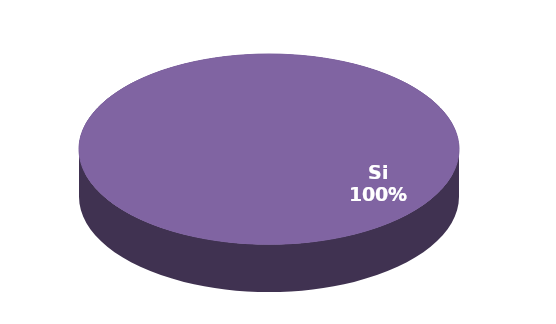
| Category | Series 1 |
|---|---|
| Si | 22 |